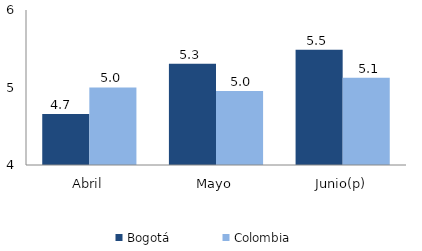
| Category | Bogotá | Colombia |
|---|---|---|
| Abril | 4.659 | 5.001 |
| Mayo | 5.308 | 4.954 |
| Junio(p) | 5.487 | 5.125 |